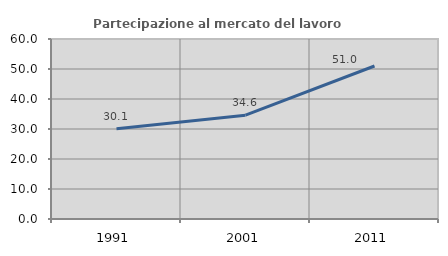
| Category | Partecipazione al mercato del lavoro  femminile |
|---|---|
| 1991.0 | 30.12 |
| 2001.0 | 34.615 |
| 2011.0 | 50.996 |